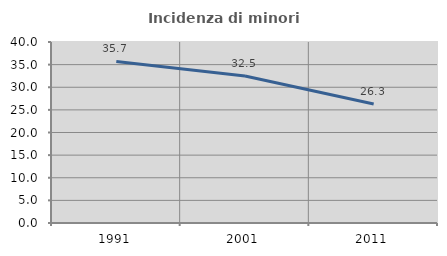
| Category | Incidenza di minori stranieri |
|---|---|
| 1991.0 | 35.714 |
| 2001.0 | 32.479 |
| 2011.0 | 26.282 |